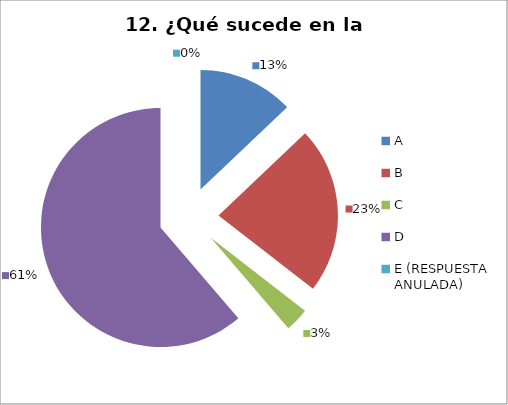
| Category | CANTIDAD DE RESPUESTAS PREGUNTA (12) | PORCENTAJE |
|---|---|---|
| A | 4 | 0.129 |
| B | 7 | 0.226 |
| C | 1 | 0.032 |
| D | 19 | 0.613 |
| E (RESPUESTA ANULADA) | 0 | 0 |